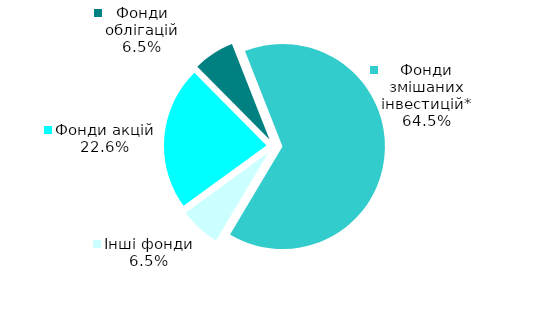
| Category | Series 0 |
|---|---|
| Фонди акцій | 7 |
| Фонди облігацій | 2 |
| Фонди змішаних інвестицій* | 20 |
| Інші фонди | 2 |